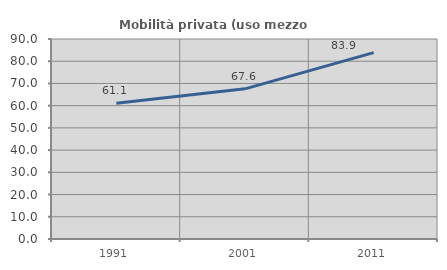
| Category | Mobilità privata (uso mezzo privato) |
|---|---|
| 1991.0 | 61.111 |
| 2001.0 | 67.568 |
| 2011.0 | 83.871 |